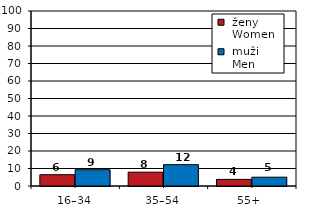
| Category |  ženy 
 Women |  muži 
 Men |
|---|---|---|
| 16–34 | 6.45 | 9.302 |
| 35–54 | 7.894 | 12.189 |
| 55+  | 3.778 | 5.033 |